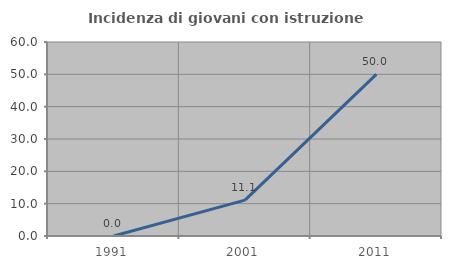
| Category | Incidenza di giovani con istruzione universitaria |
|---|---|
| 1991.0 | 0 |
| 2001.0 | 11.111 |
| 2011.0 | 50 |